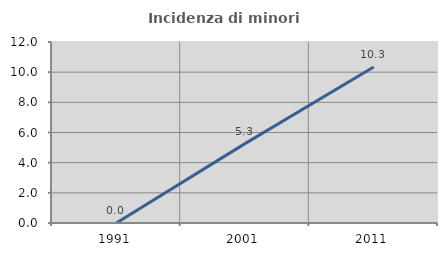
| Category | Incidenza di minori stranieri |
|---|---|
| 1991.0 | 0 |
| 2001.0 | 5.263 |
| 2011.0 | 10.345 |